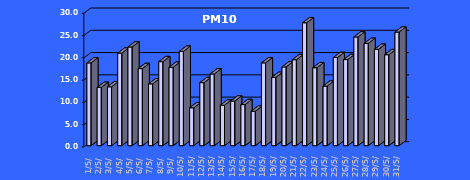
| Category | PM10 [µg/m3] |
|---|---|
| 2023-05-01 | 18.574 |
| 2023-05-02 | 13.073 |
| 2023-05-03 | 13.214 |
| 2023-05-04 | 20.76 |
| 2023-05-05 | 22.144 |
| 2023-05-06 | 17.295 |
| 2023-05-07 | 13.871 |
| 2023-05-08 | 18.849 |
| 2023-05-09 | 17.595 |
| 2023-05-10 | 21.168 |
| 2023-05-11 | 8.498 |
| 2023-05-12 | 14.146 |
| 2023-05-13 | 16.08 |
| 2023-05-14 | 9.088 |
| 2023-05-15 | 10.022 |
| 2023-05-16 | 9.213 |
| 2023-05-17 | 7.727 |
| 2023-05-18 | 18.58 |
| 2023-05-19 | 15.318 |
| 2023-05-20 | 17.673 |
| 2023-05-21 | 19.291 |
| 2023-05-22 | 27.575 |
| 2023-05-23 | 17.483 |
| 2023-05-24 | 13.362 |
| 2023-05-25 | 19.777 |
| 2023-05-26 | 19.318 |
| 2023-05-27 | 24.397 |
| 2023-05-28 | 22.942 |
| 2023-05-29 | 21.616 |
| 2023-05-30 | 20.408 |
| 2023-05-31 | 25.49 |